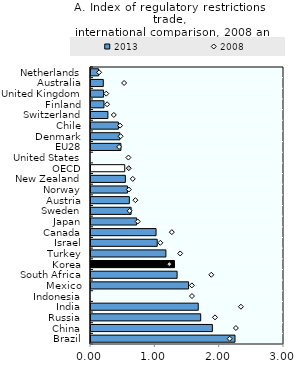
| Category | 2013 |
|---|---|
| Brazil | 2.239 |
| China | 1.887 |
| Russia | 1.705 |
| India | 1.667 |
| Indonesia | 0 |
| Mexico | 1.517 |
| South Africa | 1.338 |
| Korea | 1.297 |
| Turkey | 1.164 |
| Israel | 1.029 |
| Canada | 1.011 |
| Japan | 0.71 |
| Sweden | 0.623 |
| Austria | 0.596 |
| Norway | 0.567 |
| New Zealand | 0.534 |
| OECD | 0.524 |
| United States | 0 |
| EU28 | 0.465 |
| Denmark | 0.449 |
| Chile | 0.426 |
| Switzerland | 0.263 |
| Finland | 0.202 |
| United Kingdom | 0.195 |
| Australia | 0.191 |
| Netherlands | 0.118 |